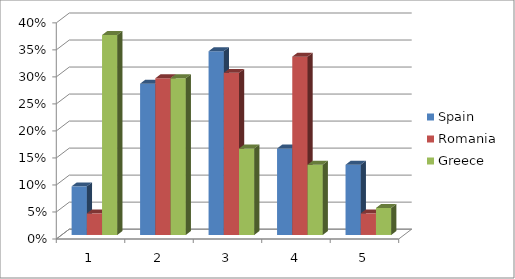
| Category | Spain | Romania | Greece |
|---|---|---|---|
| 0 | 0.09 | 0.04 | 0.37 |
| 1 | 0.28 | 0.29 | 0.29 |
| 2 | 0.34 | 0.3 | 0.16 |
| 3 | 0.16 | 0.33 | 0.13 |
| 4 | 0.13 | 0.04 | 0.05 |